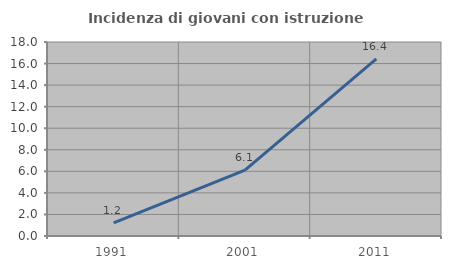
| Category | Incidenza di giovani con istruzione universitaria |
|---|---|
| 1991.0 | 1.22 |
| 2001.0 | 6.111 |
| 2011.0 | 16.425 |